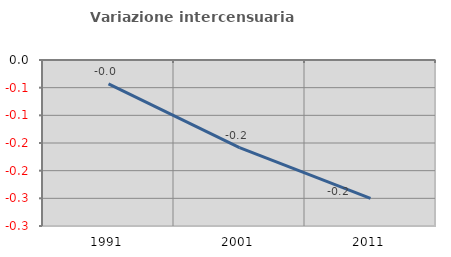
| Category | Variazione intercensuaria annua |
|---|---|
| 1991.0 | -0.043 |
| 2001.0 | -0.158 |
| 2011.0 | -0.25 |